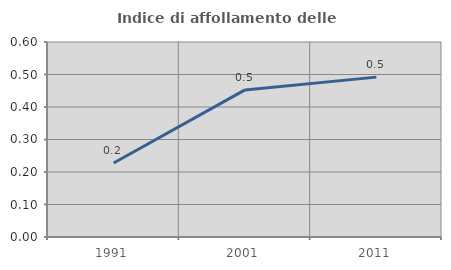
| Category | Indice di affollamento delle abitazioni  |
|---|---|
| 1991.0 | 0.228 |
| 2001.0 | 0.453 |
| 2011.0 | 0.492 |